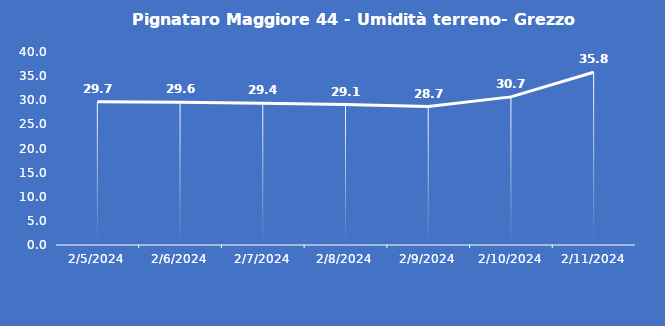
| Category | Pignataro Maggiore 44 - Umidità terreno- Grezzo (%VWC) |
|---|---|
| 2/5/24 | 29.7 |
| 2/6/24 | 29.6 |
| 2/7/24 | 29.4 |
| 2/8/24 | 29.1 |
| 2/9/24 | 28.7 |
| 2/10/24 | 30.7 |
| 2/11/24 | 35.8 |